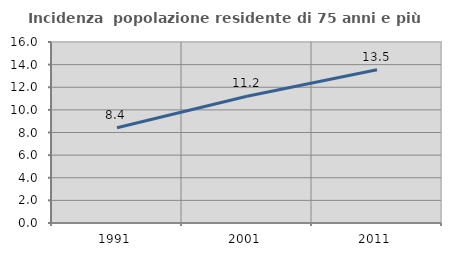
| Category | Incidenza  popolazione residente di 75 anni e più |
|---|---|
| 1991.0 | 8.419 |
| 2001.0 | 11.21 |
| 2011.0 | 13.548 |